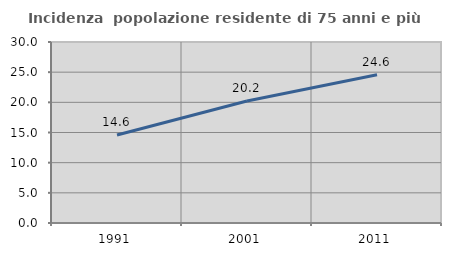
| Category | Incidenza  popolazione residente di 75 anni e più |
|---|---|
| 1991.0 | 14.589 |
| 2001.0 | 20.232 |
| 2011.0 | 24.565 |